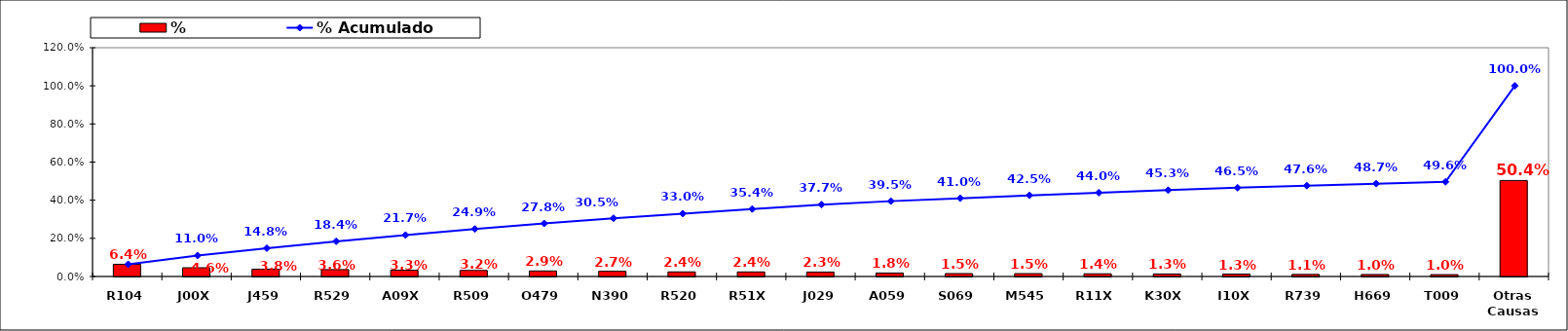
| Category | % |
|---|---|
| R104 | 0.064 |
| J00X | 0.046 |
| J459 | 0.038 |
| R529 | 0.036 |
| A09X | 0.033 |
| R509 | 0.032 |
| O479 | 0.029 |
| N390 | 0.027 |
| R520 | 0.024 |
| R51X | 0.024 |
| J029 | 0.023 |
| A059 | 0.018 |
| S069 | 0.015 |
| M545 | 0.015 |
| R11X | 0.014 |
| K30X | 0.013 |
| I10X | 0.013 |
| R739 | 0.011 |
| H669 | 0.01 |
| T009 | 0.01 |
| Otras Causas | 0.504 |